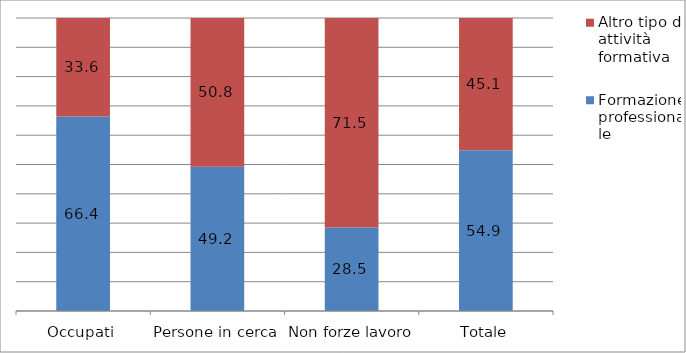
| Category | Formazione professionale | Altro tipo di attività formativa |
|---|---|---|
| Occupati | 66.422 | 33.578 |
| Persone in cerca | 49.227 | 50.773 |
| Non forze lavoro | 28.496 | 71.504 |
| Totale | 54.903 | 45.097 |